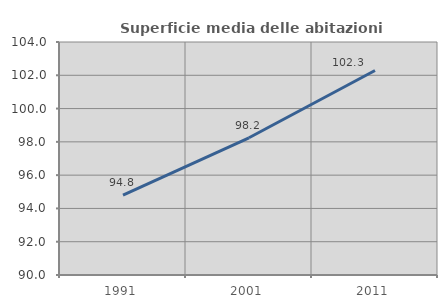
| Category | Superficie media delle abitazioni occupate |
|---|---|
| 1991.0 | 94.803 |
| 2001.0 | 98.244 |
| 2011.0 | 102.29 |